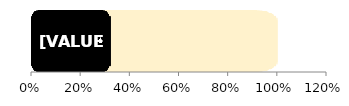
| Category | Total | Women |
|---|---|---|
| 0 | 1 | 0.321 |